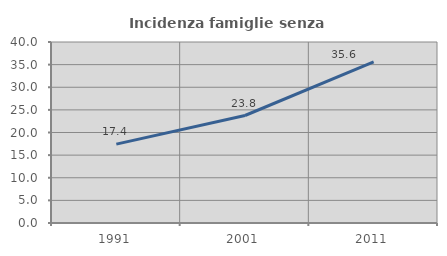
| Category | Incidenza famiglie senza nuclei |
|---|---|
| 1991.0 | 17.432 |
| 2001.0 | 23.756 |
| 2011.0 | 35.582 |